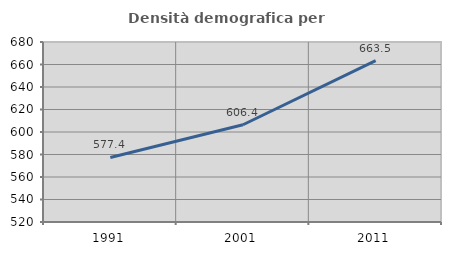
| Category | Densità demografica |
|---|---|
| 1991.0 | 577.36 |
| 2001.0 | 606.439 |
| 2011.0 | 663.525 |